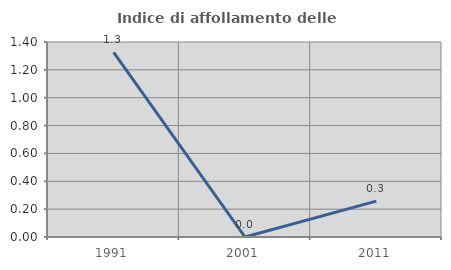
| Category | Indice di affollamento delle abitazioni  |
|---|---|
| 1991.0 | 1.326 |
| 2001.0 | 0 |
| 2011.0 | 0.258 |